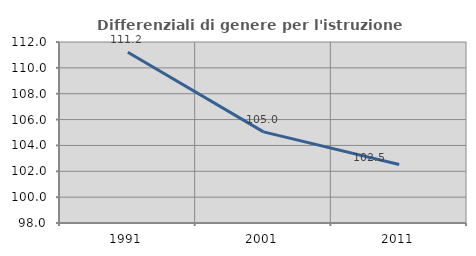
| Category | Differenziali di genere per l'istruzione superiore |
|---|---|
| 1991.0 | 111.202 |
| 2001.0 | 105.048 |
| 2011.0 | 102.527 |